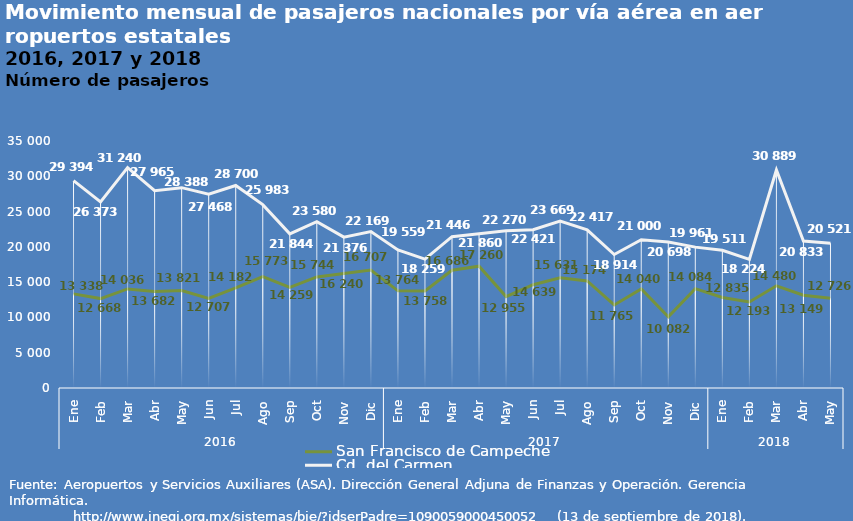
| Category | San Francisco de Campeche | Cd. del Carmen  |
|---|---|---|
| 0 | 13338 | 29394 |
| 1 | 12668 | 26373 |
| 2 | 14036 | 31240 |
| 3 | 13682 | 27965 |
| 4 | 13821 | 28388 |
| 5 | 12707 | 27468 |
| 6 | 14182 | 28700 |
| 7 | 15773 | 25983 |
| 8 | 14259 | 21844 |
| 9 | 15744 | 23580 |
| 10 | 16240 | 21376 |
| 11 | 16707 | 22169 |
| 12 | 13764 | 19559 |
| 13 | 13758 | 18259 |
| 14 | 16686 | 21446 |
| 15 | 17260 | 21860 |
| 16 | 12955 | 22270 |
| 17 | 14639 | 22421 |
| 18 | 15631 | 23669 |
| 19 | 15174 | 22417 |
| 20 | 11765 | 18914 |
| 21 | 14040 | 21000 |
| 22 | 10082 | 20698 |
| 23 | 14084 | 19961 |
| 24 | 12835 | 19511 |
| 25 | 12193 | 18224 |
| 26 | 14480 | 30889 |
| 27 | 13149 | 20833 |
| 28 | 12726 | 20521 |